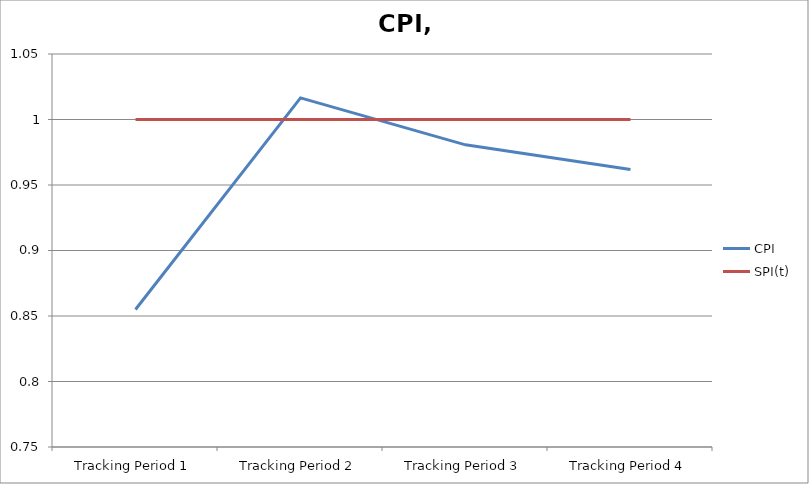
| Category | CPI | SPI(t) |
|---|---|---|
| Tracking Period 1 | 0.855 | 1 |
| Tracking Period 2 | 1.017 | 1 |
| Tracking Period 3 | 0.981 | 1 |
| Tracking Period 4 | 0.962 | 1 |